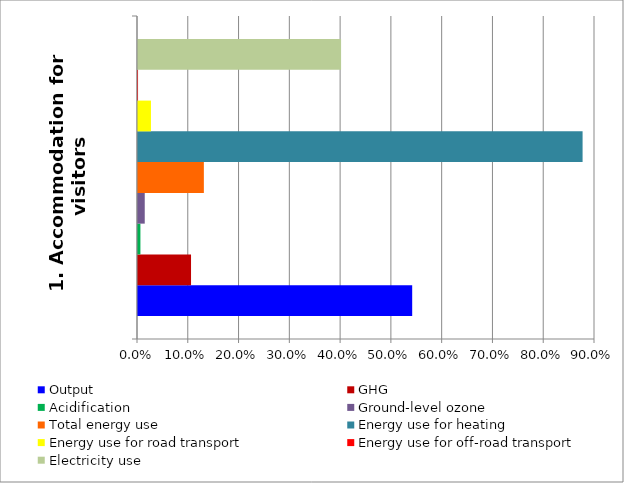
| Category | Output | GHG | Acidification | Ground-level ozone | Total energy use | Energy use for heating | Energy use for road transport | Energy use for off-road transport | Electricity use |
|---|---|---|---|---|---|---|---|---|---|
| 1. Accommodation for visitors | 0.54 | 0.104 | 0.005 | 0.013 | 0.13 | 0.876 | 0.026 | 0 | 0.4 |